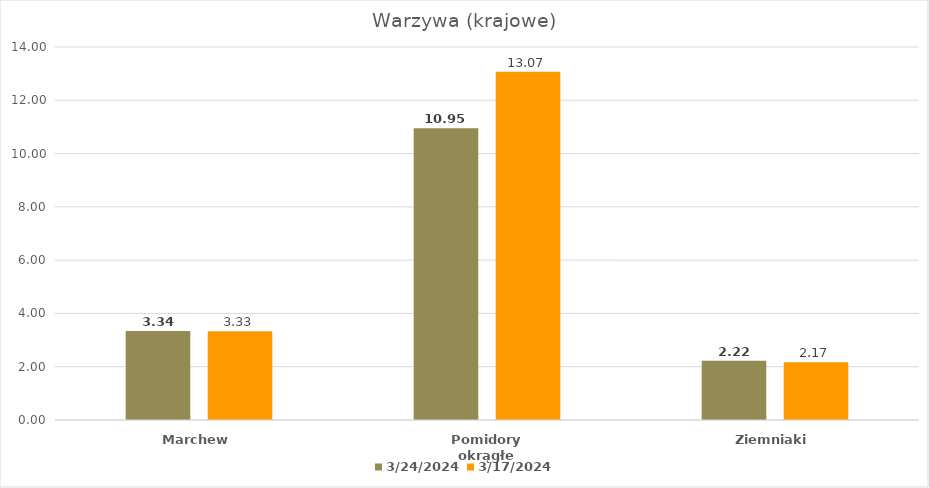
| Category | 2024-03-24 | 2024-03-17 |
|---|---|---|
| Marchew | 3.34 | 3.33 |
| Pomidory okrągłe | 10.95 | 13.07 |
| Ziemniaki | 2.22 | 2.17 |